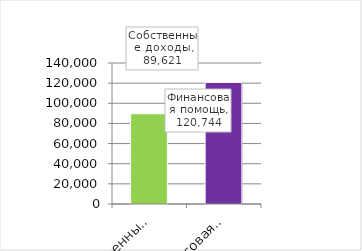
| Category | Series 0 |
|---|---|
| Собственные доходы | 89621 |
| Финансовая помощь | 120744 |